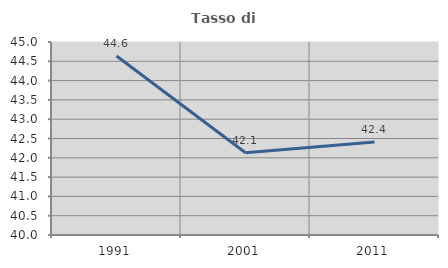
| Category | Tasso di occupazione   |
|---|---|
| 1991.0 | 44.638 |
| 2001.0 | 42.129 |
| 2011.0 | 42.411 |